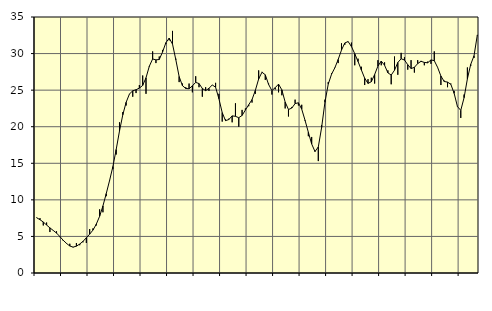
| Category | Piggar | Series 1 |
|---|---|---|
| nan | 7.6 | 7.55 |
| 87.0 | 7.5 | 7.29 |
| 87.0 | 6.5 | 6.97 |
| 87.0 | 6.9 | 6.56 |
| nan | 5.6 | 6.17 |
| 88.0 | 5.8 | 5.82 |
| 88.0 | 5.7 | 5.46 |
| 88.0 | 4.9 | 4.99 |
| nan | 4.4 | 4.48 |
| 89.0 | 4 | 4.05 |
| 89.0 | 4 | 3.69 |
| 89.0 | 3.5 | 3.54 |
| nan | 4.1 | 3.67 |
| 90.0 | 3.8 | 3.96 |
| 90.0 | 4.2 | 4.33 |
| 90.0 | 4.1 | 4.82 |
| nan | 6 | 5.31 |
| 91.0 | 6.1 | 5.87 |
| 91.0 | 6.5 | 6.68 |
| 91.0 | 8.7 | 7.75 |
| nan | 8.3 | 9.17 |
| 92.0 | 10.5 | 10.85 |
| 92.0 | 12.7 | 12.63 |
| 92.0 | 14.2 | 14.54 |
| nan | 16.2 | 16.88 |
| 93.0 | 20.6 | 19.41 |
| 93.0 | 22 | 21.63 |
| 93.0 | 22.9 | 23.33 |
| nan | 24.5 | 24.47 |
| 94.0 | 24.1 | 24.91 |
| 94.0 | 24.6 | 25.06 |
| 94.0 | 25.7 | 25.28 |
| nan | 27 | 25.64 |
| 95.0 | 24.5 | 26.69 |
| 95.0 | 28.2 | 28.27 |
| 95.0 | 30.3 | 29.26 |
| nan | 28.7 | 29.14 |
| 96.0 | 29.6 | 29.19 |
| 96.0 | 30.5 | 30.22 |
| 96.0 | 31.3 | 31.48 |
| nan | 31.8 | 32.11 |
| 97.0 | 33.1 | 31.3 |
| 97.0 | 29.3 | 29.16 |
| 97.0 | 26.1 | 26.86 |
| nan | 25.9 | 25.61 |
| 98.0 | 25.4 | 25.23 |
| 98.0 | 25.9 | 25.19 |
| 98.0 | 24.7 | 25.59 |
| nan | 26.9 | 26.06 |
| 99.0 | 25.4 | 25.9 |
| 99.0 | 24.1 | 25.23 |
| 99.0 | 25.4 | 24.93 |
| nan | 24.9 | 25.25 |
| 0.0 | 25.7 | 25.71 |
| 0.0 | 26 | 25.4 |
| 0.0 | 24.5 | 23.83 |
| nan | 20.7 | 21.93 |
| 1.0 | 21 | 20.83 |
| 1.0 | 21.1 | 20.98 |
| 1.0 | 20.6 | 21.48 |
| nan | 23.2 | 21.42 |
| 2.0 | 20 | 21.23 |
| 2.0 | 22.3 | 21.54 |
| 2.0 | 22.5 | 22.28 |
| nan | 22.8 | 23 |
| 3.0 | 23.3 | 23.71 |
| 3.0 | 24.5 | 24.96 |
| 3.0 | 27.7 | 26.53 |
| nan | 27.5 | 27.45 |
| 4.0 | 26.4 | 27.1 |
| 4.0 | 25.9 | 25.78 |
| 4.0 | 24.4 | 24.94 |
| nan | 25.1 | 25.34 |
| 5.0 | 24.7 | 25.82 |
| 5.0 | 24.3 | 25.04 |
| 5.0 | 22.5 | 23.37 |
| nan | 21.4 | 22.35 |
| 6.0 | 22.7 | 22.55 |
| 6.0 | 23.7 | 23.16 |
| 6.0 | 22.9 | 23.27 |
| nan | 23 | 22.4 |
| 7.0 | 20.8 | 20.88 |
| 7.0 | 18.7 | 19.24 |
| 7.0 | 18.6 | 17.64 |
| nan | 16.7 | 16.61 |
| 8.0 | 15.3 | 17.23 |
| 8.0 | 20.2 | 19.89 |
| 8.0 | 23.7 | 23.33 |
| nan | 26.1 | 25.82 |
| 9.0 | 27.3 | 27.18 |
| 9.0 | 28.1 | 28.06 |
| 9.0 | 28.7 | 29.19 |
| nan | 31.4 | 30.48 |
| 10.0 | 31.2 | 31.45 |
| 10.0 | 31.6 | 31.64 |
| 10.0 | 31.5 | 30.96 |
| nan | 28.4 | 29.98 |
| 11.0 | 29.3 | 28.91 |
| 11.0 | 28.2 | 27.76 |
| 11.0 | 25.7 | 26.63 |
| nan | 26.5 | 25.92 |
| 12.0 | 26.7 | 26.15 |
| 12.0 | 25.9 | 27.13 |
| 12.0 | 29.1 | 28.3 |
| nan | 28.4 | 28.97 |
| 13.0 | 28.8 | 28.4 |
| 13.0 | 27.7 | 27.37 |
| 13.0 | 25.8 | 27.06 |
| nan | 29.6 | 27.72 |
| 14.0 | 27.1 | 28.78 |
| 14.0 | 30.1 | 29.29 |
| 14.0 | 29.5 | 29.12 |
| nan | 27.8 | 28.48 |
| 15.0 | 29.1 | 27.95 |
| 15.0 | 27.4 | 28.12 |
| 15.0 | 29.1 | 28.63 |
| nan | 29 | 28.94 |
| 16.0 | 28.4 | 28.79 |
| 16.0 | 28.9 | 28.74 |
| 16.0 | 28.6 | 29.13 |
| nan | 30.3 | 29.03 |
| 17.0 | 28.1 | 28.12 |
| 17.0 | 25.7 | 26.93 |
| 17.0 | 26.3 | 26.18 |
| nan | 25.4 | 26.1 |
| 18.0 | 25.9 | 25.8 |
| 18.0 | 24.9 | 24.56 |
| 18.0 | 22.8 | 22.75 |
| nan | 21.2 | 22.24 |
| 19.0 | 24.4 | 23.97 |
| 19.0 | 28.1 | 26.55 |
| 19.0 | 28.3 | 28.52 |
| nan | 29.4 | 29.7 |
| 20.0 | 32.5 | 32.55 |